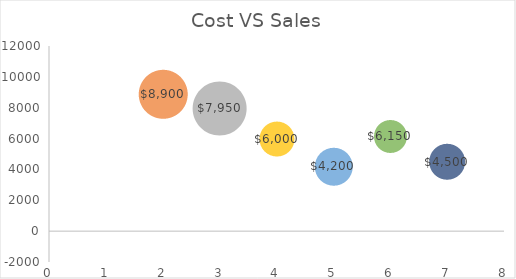
| Category | Series 0 |
|---|---|
| 0 | 0 |
| 1 | 8900 |
| 2 | 7950 |
| 3 | 6000 |
| 4 | 4200 |
| 5 | 6150 |
| 6 | 4500 |